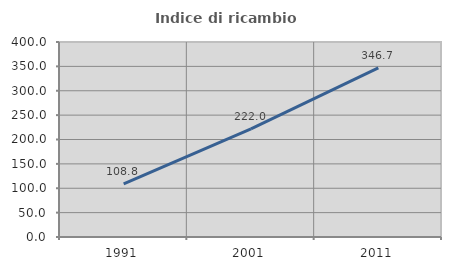
| Category | Indice di ricambio occupazionale  |
|---|---|
| 1991.0 | 108.805 |
| 2001.0 | 221.97 |
| 2011.0 | 346.729 |